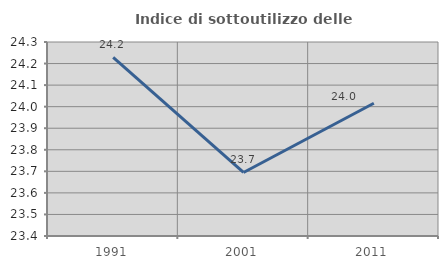
| Category | Indice di sottoutilizzo delle abitazioni  |
|---|---|
| 1991.0 | 24.229 |
| 2001.0 | 23.695 |
| 2011.0 | 24.016 |